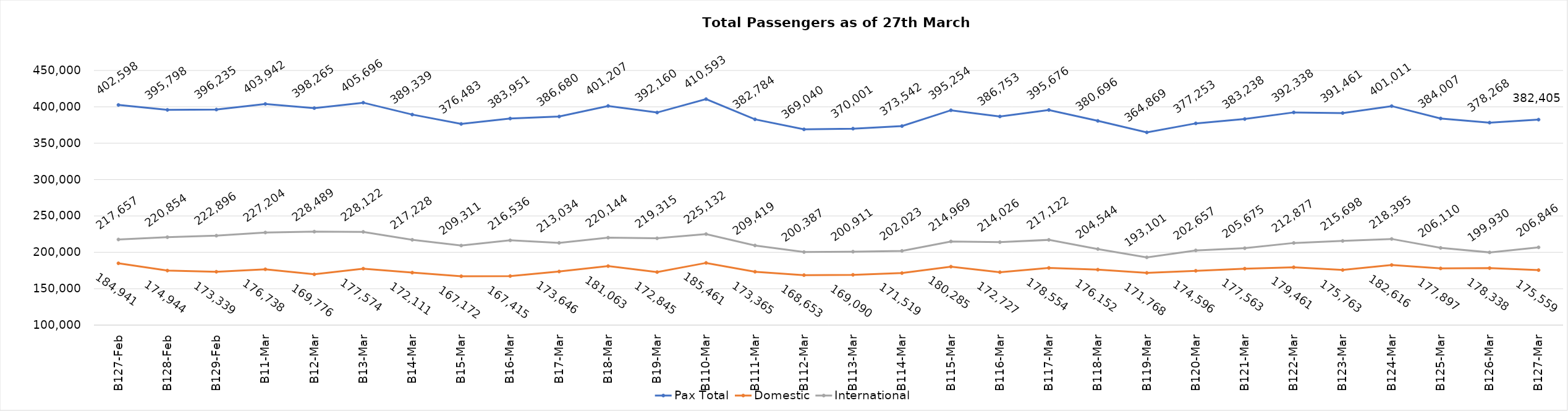
| Category | Pax Total | Domestic | International |
|---|---|---|---|
| 2024-02-27 | 402598 | 184941 | 217657 |
| 2024-02-28 | 395798 | 174944 | 220854 |
| 2024-02-29 | 396235 | 173339 | 222896 |
| 2024-03-01 | 403942 | 176738 | 227204 |
| 2024-03-02 | 398265 | 169776 | 228489 |
| 2024-03-03 | 405696 | 177574 | 228122 |
| 2024-03-04 | 389339 | 172111 | 217228 |
| 2024-03-05 | 376483 | 167172 | 209311 |
| 2024-03-06 | 383951 | 167415 | 216536 |
| 2024-03-07 | 386680 | 173646 | 213034 |
| 2024-03-08 | 401207 | 181063 | 220144 |
| 2024-03-09 | 392160 | 172845 | 219315 |
| 2024-03-10 | 410593 | 185461 | 225132 |
| 2024-03-11 | 382784 | 173365 | 209419 |
| 2024-03-12 | 369040 | 168653 | 200387 |
| 2024-03-13 | 370001 | 169090 | 200911 |
| 2024-03-14 | 373542 | 171519 | 202023 |
| 2024-03-15 | 395254 | 180285 | 214969 |
| 2024-03-16 | 386753 | 172727 | 214026 |
| 2024-03-17 | 395676 | 178554 | 217122 |
| 2024-03-18 | 380696 | 176152 | 204544 |
| 2024-03-19 | 364869 | 171768 | 193101 |
| 2024-03-20 | 377253 | 174596 | 202657 |
| 2024-03-21 | 383238 | 177563 | 205675 |
| 2024-03-22 | 392338 | 179461 | 212877 |
| 2024-03-23 | 391461 | 175763 | 215698 |
| 2024-03-24 | 401011 | 182616 | 218395 |
| 2024-03-25 | 384007 | 177897 | 206110 |
| 2024-03-26 | 378268 | 178338 | 199930 |
| 2024-03-27 | 382405 | 175559 | 206846 |